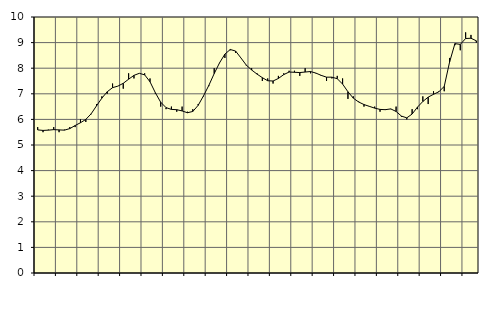
| Category | Piggar | Series 1 |
|---|---|---|
| nan | 5.7 | 5.59 |
| 1.0 | 5.5 | 5.57 |
| 1.0 | 5.6 | 5.58 |
| 1.0 | 5.7 | 5.6 |
| nan | 5.5 | 5.59 |
| 2.0 | 5.6 | 5.58 |
| 2.0 | 5.7 | 5.64 |
| 2.0 | 5.7 | 5.76 |
| nan | 6 | 5.87 |
| 3.0 | 5.9 | 6 |
| 3.0 | 6.2 | 6.22 |
| 3.0 | 6.6 | 6.53 |
| nan | 6.9 | 6.83 |
| 4.0 | 7 | 7.08 |
| 4.0 | 7.4 | 7.24 |
| 4.0 | 7.3 | 7.3 |
| nan | 7.2 | 7.41 |
| 5.0 | 7.8 | 7.57 |
| 5.0 | 7.6 | 7.72 |
| 5.0 | 7.8 | 7.8 |
| nan | 7.8 | 7.74 |
| 6.0 | 7.6 | 7.47 |
| 6.0 | 7 | 7.04 |
| 6.0 | 6.5 | 6.67 |
| nan | 6.4 | 6.46 |
| 7.0 | 6.5 | 6.39 |
| 7.0 | 6.3 | 6.38 |
| 7.0 | 6.5 | 6.33 |
| nan | 6.3 | 6.26 |
| 8.0 | 6.4 | 6.31 |
| 8.0 | 6.6 | 6.55 |
| 8.0 | 6.9 | 6.92 |
| nan | 7.3 | 7.33 |
| 9.0 | 8 | 7.79 |
| 9.0 | 8.2 | 8.21 |
| 9.0 | 8.4 | 8.55 |
| nan | 8.7 | 8.73 |
| 10.0 | 8.6 | 8.67 |
| 10.0 | 8.4 | 8.4 |
| 10.0 | 8.1 | 8.12 |
| nan | 8 | 7.93 |
| 11.0 | 7.8 | 7.77 |
| 11.0 | 7.5 | 7.63 |
| 11.0 | 7.6 | 7.51 |
| nan | 7.4 | 7.5 |
| 12.0 | 7.7 | 7.6 |
| 12.0 | 7.8 | 7.75 |
| 12.0 | 7.9 | 7.85 |
| nan | 7.9 | 7.84 |
| 13.0 | 7.7 | 7.83 |
| 13.0 | 8 | 7.85 |
| 13.0 | 7.8 | 7.87 |
| nan | 7.8 | 7.81 |
| 14.0 | 7.7 | 7.72 |
| 14.0 | 7.5 | 7.65 |
| 14.0 | 7.6 | 7.65 |
| nan | 7.7 | 7.59 |
| 15.0 | 7.6 | 7.38 |
| 15.0 | 6.8 | 7.08 |
| 15.0 | 6.9 | 6.83 |
| nan | 6.7 | 6.68 |
| 16.0 | 6.5 | 6.58 |
| 16.0 | 6.5 | 6.51 |
| 16.0 | 6.5 | 6.44 |
| nan | 6.3 | 6.39 |
| 17.0 | 6.4 | 6.38 |
| 17.0 | 6.4 | 6.41 |
| 17.0 | 6.5 | 6.31 |
| nan | 6.1 | 6.13 |
| 18.0 | 6 | 6.06 |
| 18.0 | 6.4 | 6.21 |
| 18.0 | 6.4 | 6.48 |
| nan | 6.9 | 6.7 |
| 19.0 | 6.6 | 6.87 |
| 19.0 | 7.1 | 6.98 |
| 19.0 | 7.1 | 7.08 |
| nan | 7.1 | 7.29 |
| 20.0 | 8.4 | 8.24 |
| 20.0 | 8.9 | 8.96 |
| 20.0 | 8.7 | 8.93 |
| nan | 9.4 | 9.16 |
| 21.0 | 9.3 | 9.17 |
| 21.0 | 9 | 9.07 |